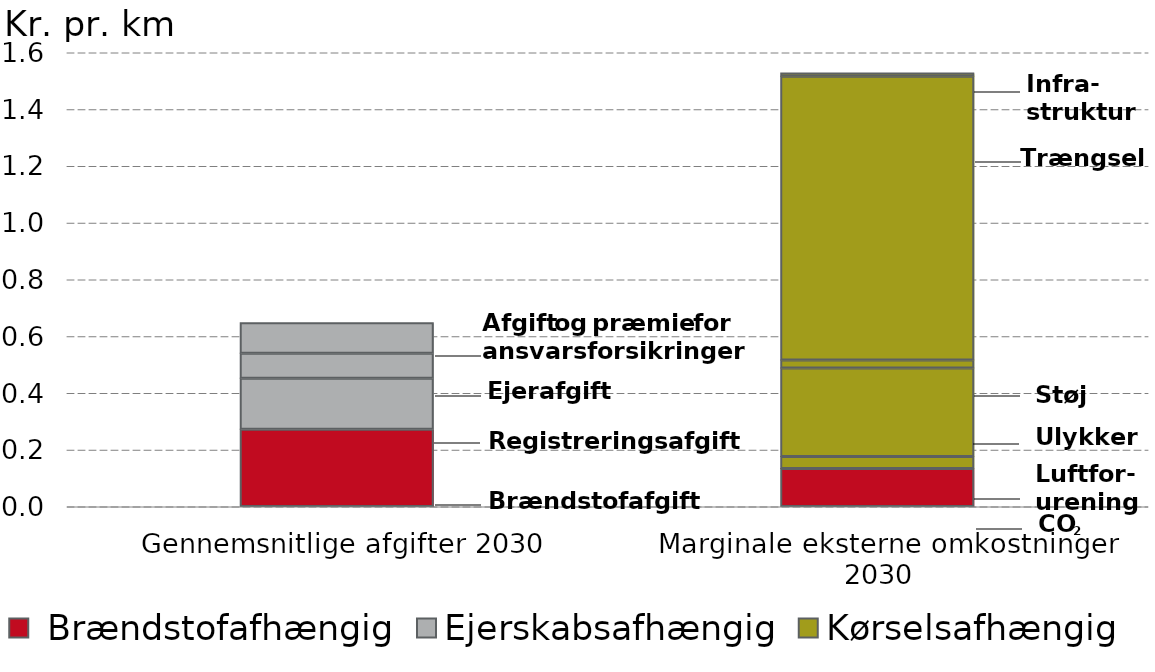
| Category |  Brændstofafhængig |  Luftforurening |  Ejerskabsafhængig |  Ulykker |  Kørselsafhængig |  Ejerafgift |  Trængsel |  Infrastruktur | Afgift og præmie for ansvarsforsikringer |
|---|---|---|---|---|---|---|---|---|---|
|  Gennemsnitlige afgifter 2030 | 0.272 | 0 | 0.18 | 0 | 0 | 0.088 | 0 | 0 | 0.107 |
|  Marginale eksterne omkostninger 2030 | 0.134 | 0.042 | 0 | 0.311 | 0.028 | 0 | 1 | 0.012 | 0 |